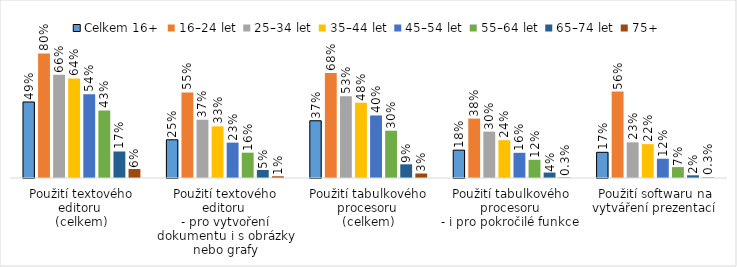
| Category | Celkem 16+ | 16–24 let | 25–34 let | 35–44 let | 45–54 let | 55–64 let | 65–74 let | 75+ |
|---|---|---|---|---|---|---|---|---|
| Použití textového editoru 
(celkem) | 0.489 | 0.801 | 0.664 | 0.64 | 0.539 | 0.435 | 0.17 | 0.058 |
| Použití textového editoru 
- pro vytvoření dokumentu i s obrázky nebo grafy | 0.246 | 0.55 | 0.374 | 0.332 | 0.227 | 0.163 | 0.052 | 0.011 |
| Použití tabulkového procesoru 
(celkem) | 0.368 | 0.675 | 0.526 | 0.484 | 0.402 | 0.304 | 0.088 | 0.029 |
| Použití tabulkového procesoru 
- i pro pokročilé funkce  | 0.179 | 0.382 | 0.298 | 0.243 | 0.162 | 0.117 | 0.035 | 0.003 |
| Použití softwaru na vytváření prezentací  | 0.165 | 0.556 | 0.229 | 0.218 | 0.124 | 0.07 | 0.017 | 0.003 |